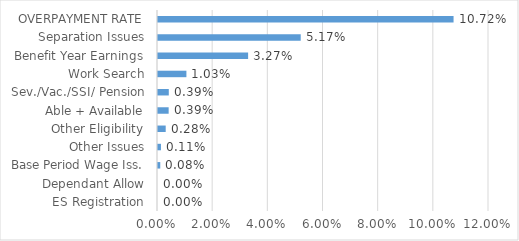
| Category | Series 0 |
|---|---|
| ES Registration | 0 |
| Dependant Allow | 0 |
| Base Period Wage Iss. | 0.001 |
| Other Issues | 0.001 |
| Other Eligibility | 0.003 |
| Able + Available | 0.004 |
| Sev./Vac./SSI/ Pension | 0.004 |
| Work Search | 0.01 |
| Benefit Year Earnings | 0.033 |
| Separation Issues | 0.052 |
| OVERPAYMENT RATE | 0.107 |